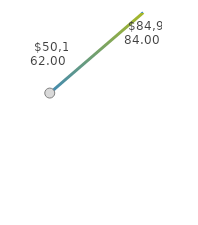
| Category | Series 0 |
|---|---|
| 0 | 50162 |
| 1 | 84984 |